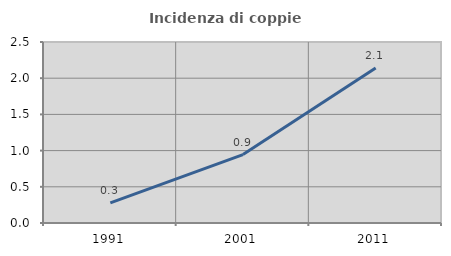
| Category | Incidenza di coppie miste |
|---|---|
| 1991.0 | 0.277 |
| 2001.0 | 0.945 |
| 2011.0 | 2.14 |